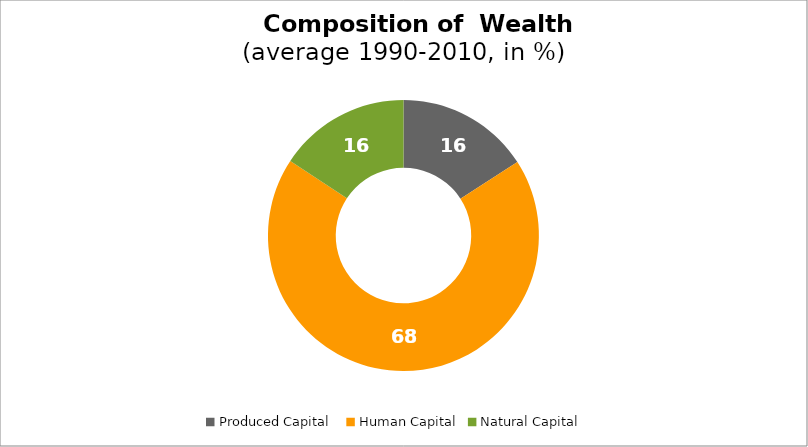
| Category | Series 0 |
|---|---|
| Produced Capital  | 15.886 |
| Human Capital | 68.372 |
| Natural Capital | 15.741 |